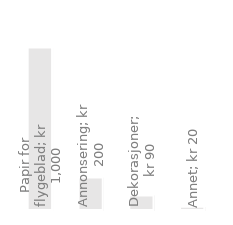
| Category | Årlige utgifter |
|---|---|
| Papir for flygeblad | 1000 |
| Annonsering | 200 |
| Dekorasjoner | 90 |
| Annet | 20 |